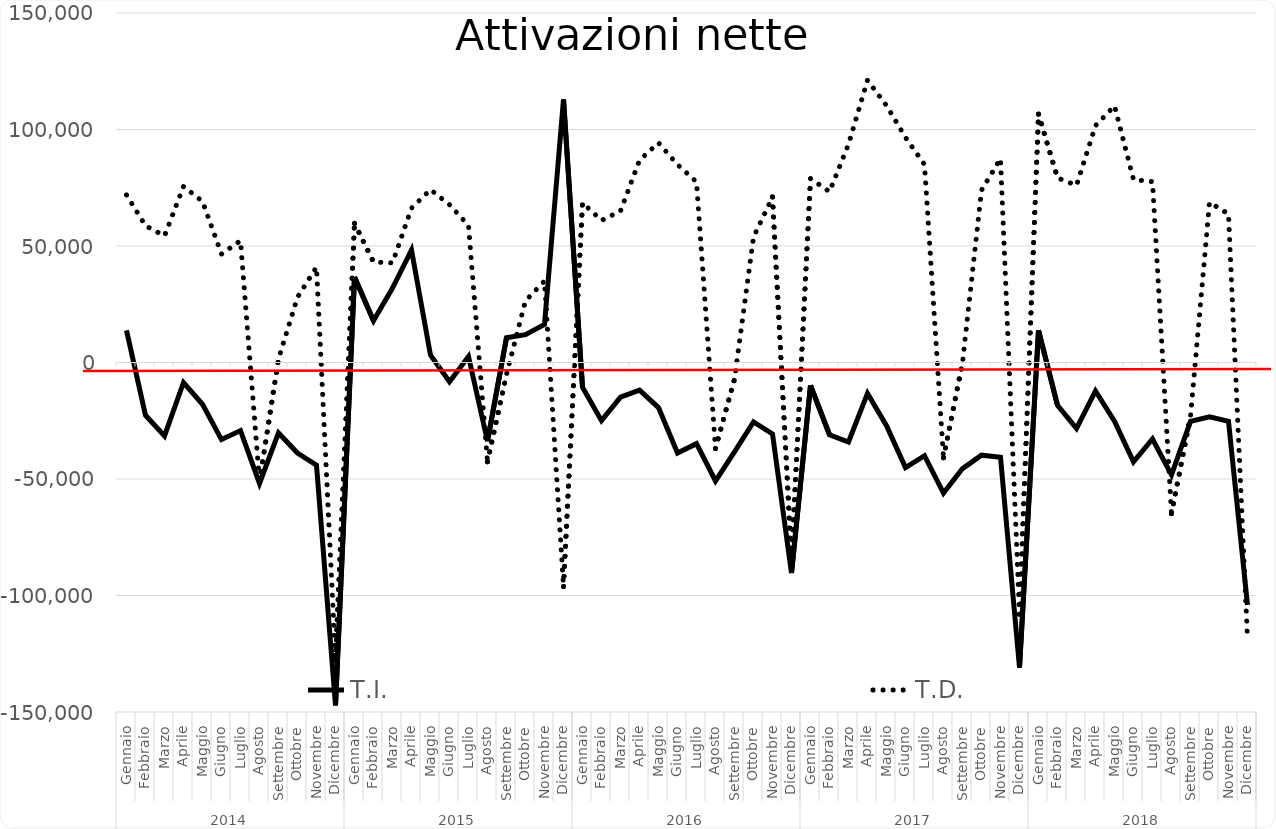
| Category | T.I. | T.D. |
|---|---|---|
| 0 | 13801 | 71906 |
| 1 | -22614 | 58688 |
| 2 | -31506 | 54316 |
| 3 | -8593 | 75559 |
| 4 | -17931 | 69132 |
| 5 | -33079 | 46555 |
| 6 | -29219 | 52282 |
| 7 | -51907 | -51155 |
| 8 | -30231 | 1531 |
| 9 | -38837 | 28010 |
| 10 | -44103 | 40921 |
| 11 | -147156 | -127590 |
| 12 | 36671 | 59709 |
| 13 | 17937 | 43117 |
| 14 | 31926 | 42744 |
| 15 | 48245 | 66257 |
| 16 | 3178 | 74197 |
| 17 | -8238 | 67729 |
| 18 | 2562 | 58803 |
| 19 | -33811 | -42589 |
| 20 | 10661 | -5082 |
| 21 | 11939 | 26479 |
| 22 | 16373 | 34994 |
| 23 | 112884 | -96135 |
| 24 | -10591 | 68560 |
| 25 | -24945 | 60969 |
| 26 | -14888 | 64990 |
| 27 | -11876 | 86794 |
| 28 | -19344 | 94298 |
| 29 | -38851 | 84934 |
| 30 | -34848 | 77509 |
| 31 | -50828 | -36934 |
| 32 | -38410 | -7100 |
| 33 | -25518 | 53792 |
| 34 | -30675 | 71061 |
| 35 | -90391 | -84749 |
| 36 | -9821 | 78947 |
| 37 | -31006 | 73302 |
| 38 | -34117 | 93657 |
| 39 | -13254 | 121137 |
| 40 | -27143 | 110260 |
| 41 | -45103 | 96586 |
| 42 | -40010 | 84990 |
| 43 | -56048 | -40904 |
| 44 | -45530 | -136 |
| 45 | -39771 | 73922 |
| 46 | -40637 | 87505 |
| 47 | -130950 | -108020 |
| 48 | 13772 | 106608 |
| 49 | -18412 | 79232 |
| 50 | -28288 | 75986 |
| 51 | -12218 | 101661 |
| 52 | -25173 | 110154 |
| 53 | -42637 | 78491 |
| 54 | -32828 | 77622 |
| 55 | -48241 | -64862 |
| 56 | -25232 | -23076 |
| 57 | -23358 | 68731 |
| 58 | -25207 | 63736 |
| 59 | -104108 | -118942 |